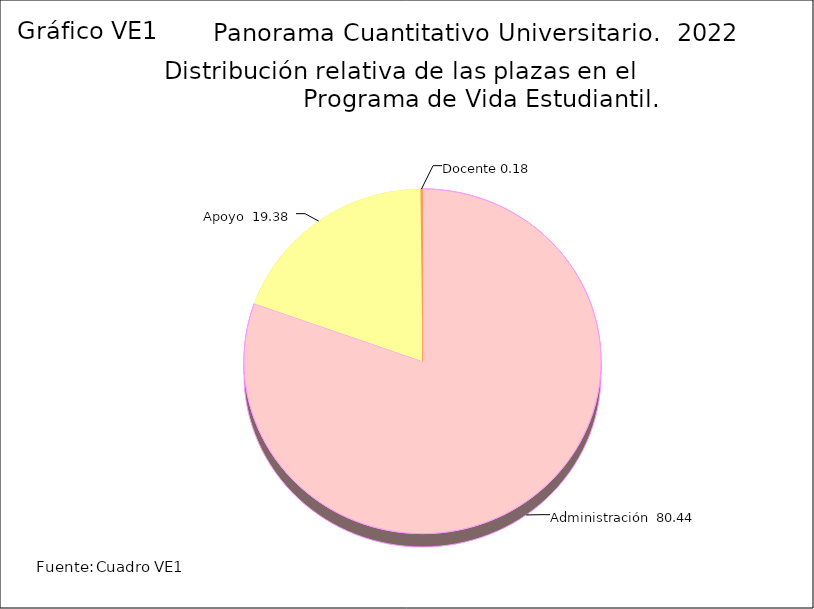
| Category | Series 3 |
|---|---|
| Administración  | 80.44 |
| Apoyo  | 19.38 |
| Docente | 0.18 |